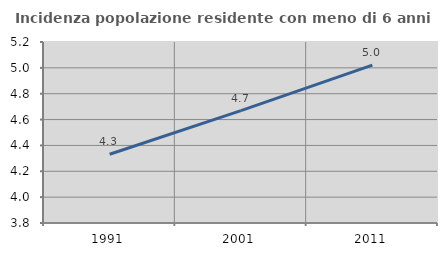
| Category | Incidenza popolazione residente con meno di 6 anni |
|---|---|
| 1991.0 | 4.332 |
| 2001.0 | 4.669 |
| 2011.0 | 5.021 |